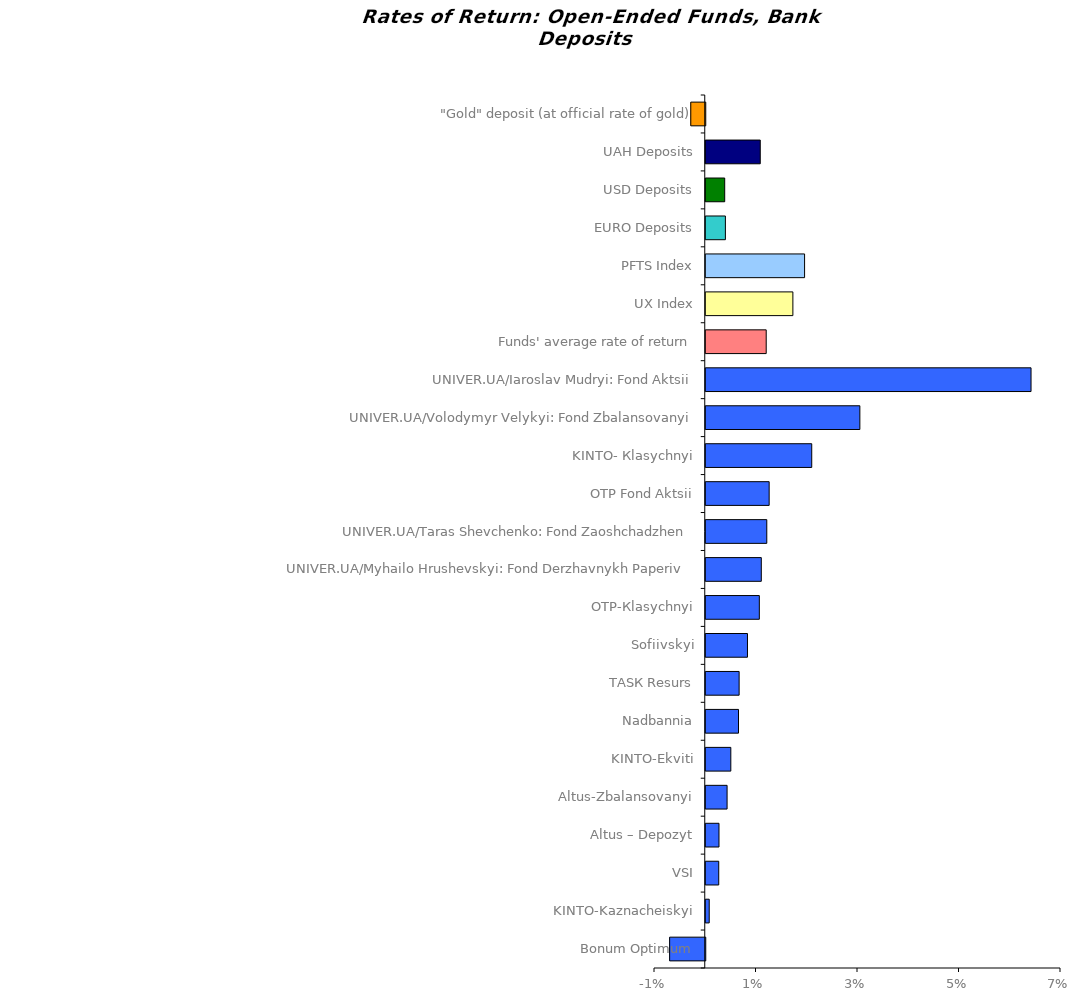
| Category | Series 0 |
|---|---|
| Bonum Optimum | -0.007 |
| KINTO-Kaznacheiskyi | 0.001 |
| VSI | 0.003 |
| Altus – Depozyt | 0.003 |
| Аltus-Zbalansovanyi | 0.004 |
| KINTO-Ekviti | 0.005 |
| Nadbannia | 0.006 |
| ТАSК Resurs | 0.007 |
| Sofiivskyi | 0.008 |
| OTP-Кlasychnyi | 0.011 |
| UNIVER.UA/Myhailo Hrushevskyi: Fond Derzhavnykh Paperiv    | 0.011 |
| UNIVER.UA/Taras Shevchenko: Fond Zaoshchadzhen | 0.012 |
| ОТP Fond Aktsii | 0.012 |
| KINTO- Кlasychnyi | 0.021 |
| UNIVER.UA/Volodymyr Velykyi: Fond Zbalansovanyi | 0.03 |
| UNIVER.UA/Iaroslav Mudryi: Fond Aktsii | 0.064 |
| Funds' average rate of return | 0.012 |
| UX Index | 0.017 |
| PFTS Index | 0.019 |
| EURO Deposits | 0.004 |
| USD Deposits | 0.004 |
| UAH Deposits | 0.011 |
| "Gold" deposit (at official rate of gold) | -0.003 |